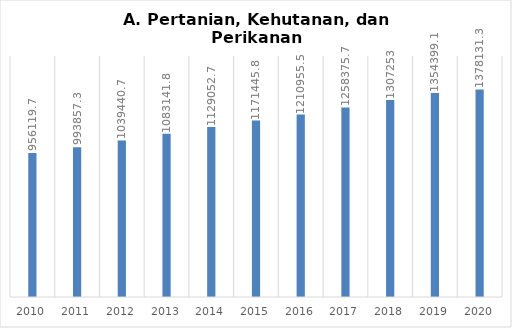
| Category | A. Pertanian, Kehutanan, dan Perikanan |
|---|---|
| 2010 | 956119.7 |
| 2011 | 993857.3 |
| 2012 | 1039440.7 |
| 2013 | 1083141.8 |
| 2014 | 1129052.7 |
| 2015 | 1171445.8 |
| 2016 | 1210955.5 |
| 2017 | 1258375.7 |
| 2018 | 1307253 |
| 2019 | 1354399.1 |
| 2020 | 1378131.3 |